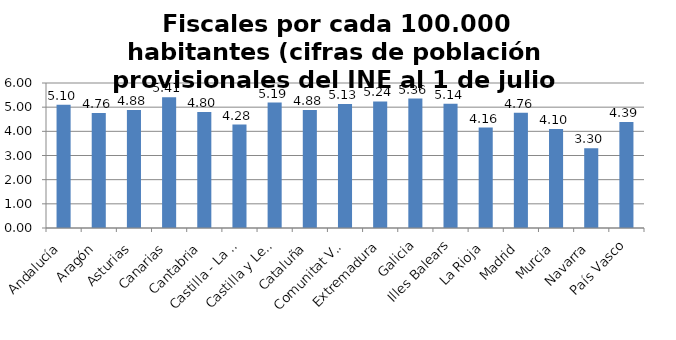
| Category | Fiscales por cada 100.000 habitantes |
|---|---|
| Andalucía | 5.1 |
| Aragón | 4.764 |
| Asturias | 4.883 |
| Canarias | 5.408 |
| Cantabria | 4.796 |
| Castilla - La Mancha | 4.282 |
| Castilla y León | 5.191 |
| Cataluña | 4.879 |
| Comunitat Valenciana | 5.126 |
| Extremadura | 5.239 |
| Galicia | 5.355 |
| Illes Balears | 5.136 |
| La Rioja | 4.158 |
| Madrid | 4.765 |
| Murcia | 4.095 |
| Navarra | 3.301 |
| País Vasco | 4.389 |